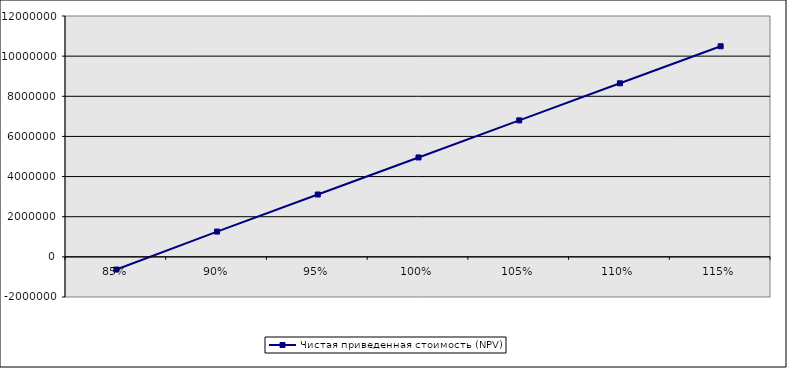
| Category | Чистая приведенная стоимость (NPV) |
|---|---|
| 0.85 | -632552.479 |
| 0.9 | 1259994.668 |
| 0.9500000000000001 | 3106637.584 |
| 1.0 | 4953280.5 |
| 1.05 | 6799923.416 |
| 1.1 | 8646566.332 |
| 1.1500000000000001 | 10493209.248 |